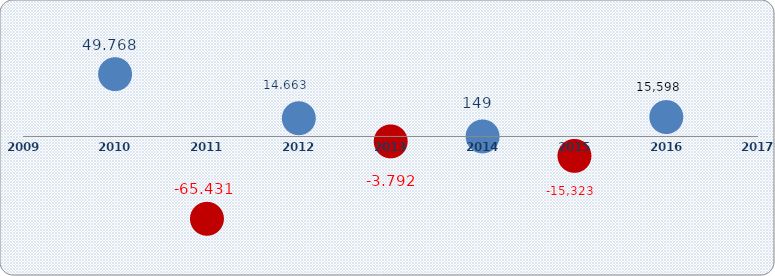
| Category | Dobit ili gubitak razdoblja  |
|---|---|
| 2010.0 | 49768 |
| 2011.0 | -65431 |
| 2012.0 | 14663 |
| 2013.0 | -3792 |
| 2014.0 | 149 |
| 2015.0 | -15323.002 |
| 2016.0 | 15598.27 |